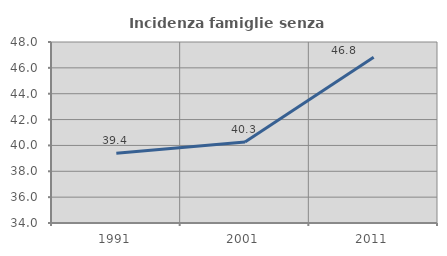
| Category | Incidenza famiglie senza nuclei |
|---|---|
| 1991.0 | 39.394 |
| 2001.0 | 40.273 |
| 2011.0 | 46.823 |